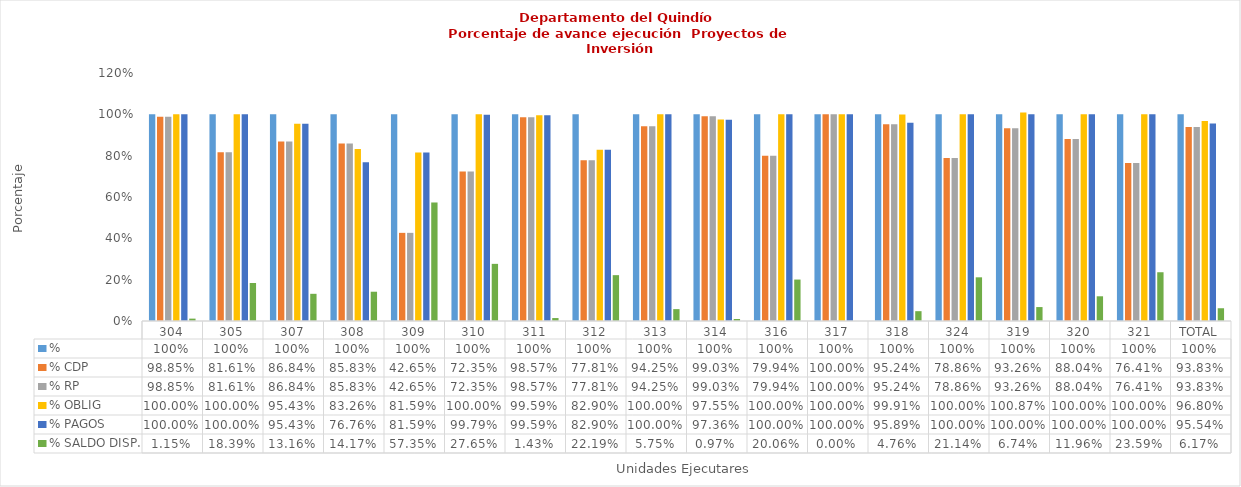
| Category | % | % CDP | % RP | % OBLIG | % PAGOS | % SALDO DISP. |
|---|---|---|---|---|---|---|
| 304 | 1 | 0.989 | 0.989 | 1 | 1 | 0.011 |
| 305 | 1 | 0.816 | 0.816 | 1 | 1 | 0.184 |
| 307 | 1 | 0.868 | 0.868 | 0.954 | 0.954 | 0.132 |
| 308 | 1 | 0.858 | 0.858 | 0.833 | 0.768 | 0.142 |
| 309 | 1 | 0.427 | 0.427 | 0.816 | 0.816 | 0.573 |
| 310 | 1 | 0.723 | 0.723 | 1 | 0.998 | 0.277 |
| 311 | 1 | 0.986 | 0.986 | 0.996 | 0.996 | 0.014 |
| 312 | 1 | 0.778 | 0.778 | 0.829 | 0.829 | 0.222 |
| 313 | 1 | 0.943 | 0.943 | 1 | 1 | 0.057 |
| 314 | 1 | 0.99 | 0.99 | 0.976 | 0.974 | 0.01 |
| 316 | 1 | 0.799 | 0.799 | 1 | 1 | 0.201 |
| 317 | 1 | 1 | 1 | 1 | 1 | 0 |
| 318 | 1 | 0.952 | 0.952 | 0.999 | 0.959 | 0.048 |
| 324 | 1 | 0.789 | 0.789 | 1 | 1 | 0.211 |
| 319 | 1 | 0.933 | 0.933 | 1.009 | 1 | 0.067 |
| 320 | 1 | 0.88 | 0.88 | 1 | 1 | 0.12 |
| 321 | 1 | 0.764 | 0.764 | 1 | 1 | 0.236 |
| TOTAL | 1 | 0.938 | 0.938 | 0.968 | 0.955 | 0.062 |